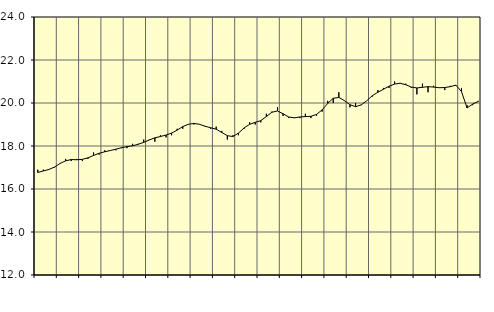
| Category | Piggar | Vård och omsorg, SNI 86-88 |
|---|---|---|
| nan | 16.9 | 16.77 |
| 1.0 | 16.9 | 16.84 |
| 1.0 | 16.9 | 16.91 |
| 1.0 | 17 | 17.02 |
| nan | 17.2 | 17.19 |
| 2.0 | 17.4 | 17.31 |
| 2.0 | 17.3 | 17.37 |
| 2.0 | 17.4 | 17.36 |
| nan | 17.3 | 17.38 |
| 3.0 | 17.4 | 17.45 |
| 3.0 | 17.7 | 17.56 |
| 3.0 | 17.6 | 17.66 |
| nan | 17.8 | 17.73 |
| 4.0 | 17.8 | 17.79 |
| 4.0 | 17.8 | 17.85 |
| 4.0 | 17.9 | 17.92 |
| nan | 17.9 | 17.97 |
| 5.0 | 18.1 | 18.01 |
| 5.0 | 18.1 | 18.08 |
| 5.0 | 18.3 | 18.17 |
| nan | 18.3 | 18.28 |
| 6.0 | 18.2 | 18.38 |
| 6.0 | 18.5 | 18.44 |
| 6.0 | 18.4 | 18.51 |
| nan | 18.5 | 18.6 |
| 7.0 | 18.8 | 18.74 |
| 7.0 | 18.8 | 18.9 |
| 7.0 | 19 | 19.01 |
| nan | 19 | 19.05 |
| 8.0 | 19 | 19.01 |
| 8.0 | 18.9 | 18.92 |
| 8.0 | 18.8 | 18.85 |
| nan | 18.9 | 18.78 |
| 9.0 | 18.7 | 18.63 |
| 9.0 | 18.3 | 18.48 |
| 9.0 | 18.5 | 18.44 |
| nan | 18.5 | 18.6 |
| 10.0 | 18.8 | 18.84 |
| 10.0 | 19.1 | 19.01 |
| 10.0 | 19 | 19.1 |
| nan | 19.1 | 19.18 |
| 11.0 | 19.5 | 19.37 |
| 11.0 | 19.6 | 19.57 |
| 11.0 | 19.8 | 19.63 |
| nan | 19.4 | 19.5 |
| 12.0 | 19.3 | 19.35 |
| 12.0 | 19.3 | 19.31 |
| 12.0 | 19.3 | 19.35 |
| nan | 19.5 | 19.37 |
| 13.0 | 19.3 | 19.38 |
| 13.0 | 19.4 | 19.47 |
| 13.0 | 19.6 | 19.68 |
| nan | 20.1 | 19.98 |
| 14.0 | 20 | 20.22 |
| 14.0 | 20.5 | 20.26 |
| 14.0 | 20.1 | 20.11 |
| nan | 19.8 | 19.92 |
| 15.0 | 20 | 19.83 |
| 15.0 | 19.9 | 19.91 |
| 15.0 | 20.1 | 20.1 |
| nan | 20.3 | 20.34 |
| 16.0 | 20.6 | 20.5 |
| 16.0 | 20.7 | 20.64 |
| 16.0 | 20.7 | 20.78 |
| nan | 21 | 20.88 |
| 17.0 | 20.9 | 20.92 |
| 17.0 | 20.9 | 20.85 |
| 17.0 | 20.7 | 20.74 |
| nan | 20.4 | 20.7 |
| 18.0 | 20.9 | 20.73 |
| 18.0 | 20.5 | 20.76 |
| 18.0 | 20.8 | 20.74 |
| nan | 20.7 | 20.71 |
| 19.0 | 20.6 | 20.72 |
| 19.0 | 20.8 | 20.76 |
| 19.0 | 20.8 | 20.83 |
| nan | 20.7 | 20.53 |
| 20.0 | 19.9 | 19.77 |
| 20.0 | 19.9 | 19.95 |
| 20.0 | 20.1 | 20.07 |